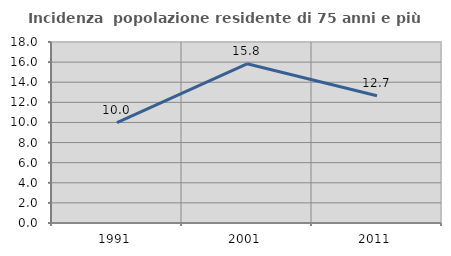
| Category | Incidenza  popolazione residente di 75 anni e più |
|---|---|
| 1991.0 | 9.985 |
| 2001.0 | 15.832 |
| 2011.0 | 12.652 |